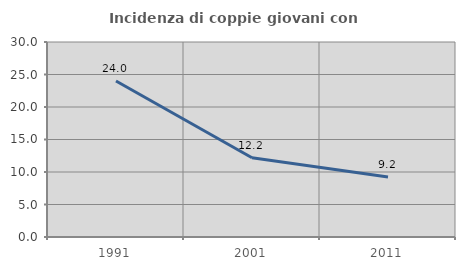
| Category | Incidenza di coppie giovani con figli |
|---|---|
| 1991.0 | 23.992 |
| 2001.0 | 12.195 |
| 2011.0 | 9.223 |